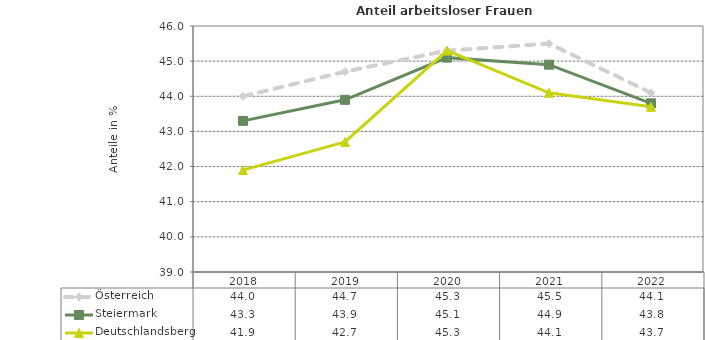
| Category | Österreich | Steiermark | Deutschlandsberg |
|---|---|---|---|
| 2022.0 | 44.1 | 43.8 | 43.7 |
| 2021.0 | 45.5 | 44.9 | 44.1 |
| 2020.0 | 45.3 | 45.1 | 45.3 |
| 2019.0 | 44.7 | 43.9 | 42.7 |
| 2018.0 | 44 | 43.3 | 41.9 |